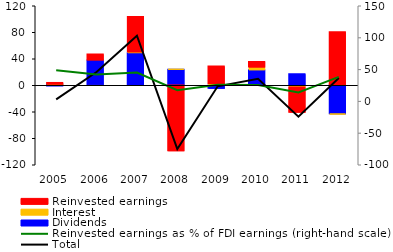
| Category | Dividends | Interest | Reinvested earnings |
|---|---|---|---|
| 2005.0 | -0.58 | 1.433 | 2.395 |
| 2006.0 | 37.904 | -0.669 | 9.035 |
| 2007.0 | 48.85 | 1.203 | 53.347 |
| 2008.0 | 23.892 | 0.422 | -99.321 |
| 2009.0 | -5.044 | 2.313 | 26.481 |
| 2010.0 | 23.016 | 4.21 | 8.228 |
| 2011.0 | 16.981 | -3.07 | -37.915 |
| 2012.0 | -43.33 | -0.184 | 80.265 |